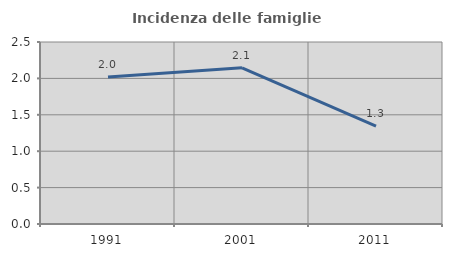
| Category | Incidenza delle famiglie numerose |
|---|---|
| 1991.0 | 2.02 |
| 2001.0 | 2.146 |
| 2011.0 | 1.345 |